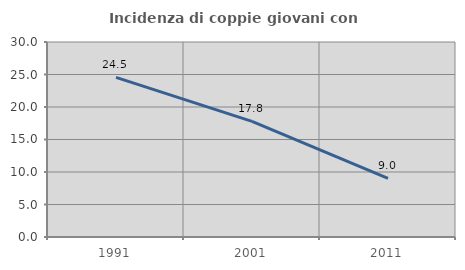
| Category | Incidenza di coppie giovani con figli |
|---|---|
| 1991.0 | 24.547 |
| 2001.0 | 17.794 |
| 2011.0 | 9.018 |